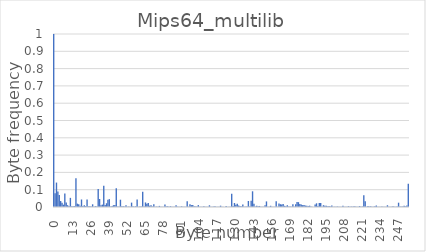
| Category | Series 0 |
|---|---|
| 0.0 | 1 |
| 1.0 | 0.08 |
| 2.0 | 0.141 |
| 3.0 | 0.089 |
| 4.0 | 0.069 |
| 5.0 | 0.034 |
| 6.0 | 0.024 |
| 7.0 | 0.013 |
| 8.0 | 0.078 |
| 9.0 | 0.027 |
| 10.0 | 0.01 |
| 11.0 | 0.006 |
| 12.0 | 0.053 |
| 13.0 | 0.004 |
| 14.0 | 0.004 |
| 15.0 | 0.005 |
| 16.0 | 0.166 |
| 17.0 | 0.019 |
| 18.0 | 0.016 |
| 19.0 | 0.007 |
| 20.0 | 0.043 |
| 21.0 | 0.005 |
| 22.0 | 0.01 |
| 23.0 | 0.005 |
| 24.0 | 0.044 |
| 25.0 | 0.004 |
| 26.0 | 0.004 |
| 27.0 | 0.003 |
| 28.0 | 0.015 |
| 29.0 | 0.002 |
| 30.0 | 0.005 |
| 31.0 | 0.003 |
| 32.0 | 0.104 |
| 33.0 | 0.046 |
| 34.0 | 0.01 |
| 35.0 | 0.014 |
| 36.0 | 0.123 |
| 37.0 | 0.011 |
| 38.0 | 0.022 |
| 39.0 | 0.042 |
| 40.0 | 0.045 |
| 41.0 | 0.003 |
| 42.0 | 0.005 |
| 43.0 | 0.011 |
| 44.0 | 0.011 |
| 45.0 | 0.109 |
| 46.0 | 0.002 |
| 47.0 | 0.003 |
| 48.0 | 0.042 |
| 49.0 | 0.005 |
| 50.0 | 0.004 |
| 51.0 | 0.003 |
| 52.0 | 0.01 |
| 53.0 | 0.002 |
| 54.0 | 0.002 |
| 55.0 | 0.001 |
| 56.0 | 0.025 |
| 57.0 | 0.004 |
| 58.0 | 0.002 |
| 59.0 | 0.004 |
| 60.0 | 0.043 |
| 61.0 | 0.001 |
| 62.0 | 0.003 |
| 63.0 | 0.002 |
| 64.0 | 0.089 |
| 65.0 | 0.002 |
| 66.0 | 0.026 |
| 67.0 | 0.019 |
| 68.0 | 0.023 |
| 69.0 | 0.007 |
| 70.0 | 0.009 |
| 71.0 | 0.003 |
| 72.0 | 0.015 |
| 73.0 | 0.002 |
| 74.0 | 0.002 |
| 75.0 | 0.002 |
| 76.0 | 0.006 |
| 77.0 | 0.001 |
| 78.0 | 0.001 |
| 79.0 | 0.001 |
| 80.0 | 0.014 |
| 81.0 | 0.003 |
| 82.0 | 0.004 |
| 83.0 | 0.002 |
| 84.0 | 0.005 |
| 85.0 | 0.002 |
| 86.0 | 0.002 |
| 87.0 | 0.002 |
| 88.0 | 0.01 |
| 89.0 | 0.002 |
| 90.0 | 0.001 |
| 91.0 | 0.001 |
| 92.0 | 0.004 |
| 93.0 | 0.001 |
| 94.0 | 0.002 |
| 95.0 | 0.001 |
| 96.0 | 0.033 |
| 97.0 | 0.001 |
| 98.0 | 0.017 |
| 99.0 | 0.011 |
| 100.0 | 0.012 |
| 101.0 | 0.005 |
| 102.0 | 0.003 |
| 103.0 | 0.002 |
| 104.0 | 0.011 |
| 105.0 | 0.002 |
| 106.0 | 0.002 |
| 107.0 | 0.001 |
| 108.0 | 0.004 |
| 109.0 | 0.001 |
| 110.0 | 0.001 |
| 111.0 | 0.001 |
| 112.0 | 0.01 |
| 113.0 | 0.002 |
| 114.0 | 0.002 |
| 115.0 | 0.003 |
| 116.0 | 0.004 |
| 117.0 | 0.001 |
| 118.0 | 0.001 |
| 119.0 | 0.001 |
| 120.0 | 0.008 |
| 121.0 | 0.002 |
| 122.0 | 0.001 |
| 123.0 | 0.001 |
| 124.0 | 0.005 |
| 125.0 | 0.001 |
| 126.0 | 0.001 |
| 127.0 | 0.002 |
| 128.0 | 0.077 |
| 129.0 | 0.006 |
| 130.0 | 0.023 |
| 131.0 | 0.013 |
| 132.0 | 0.019 |
| 133.0 | 0.009 |
| 134.0 | 0.005 |
| 135.0 | 0.004 |
| 136.0 | 0.015 |
| 137.0 | 0.002 |
| 138.0 | 0.002 |
| 139.0 | 0.002 |
| 140.0 | 0.035 |
| 141.0 | 0.003 |
| 142.0 | 0.036 |
| 143.0 | 0.091 |
| 144.0 | 0.019 |
| 145.0 | 0.003 |
| 146.0 | 0.007 |
| 147.0 | 0.004 |
| 148.0 | 0.006 |
| 149.0 | 0.001 |
| 150.0 | 0.002 |
| 151.0 | 0.002 |
| 152.0 | 0.01 |
| 153.0 | 0.032 |
| 154.0 | 0.001 |
| 155.0 | 0.001 |
| 156.0 | 0.007 |
| 157.0 | 0.001 |
| 158.0 | 0.001 |
| 159.0 | 0.001 |
| 160.0 | 0.034 |
| 161.0 | 0.001 |
| 162.0 | 0.021 |
| 163.0 | 0.016 |
| 164.0 | 0.014 |
| 165.0 | 0.017 |
| 166.0 | 0.007 |
| 167.0 | 0.005 |
| 168.0 | 0.01 |
| 169.0 | 0.003 |
| 170.0 | 0.003 |
| 171.0 | 0.002 |
| 172.0 | 0.015 |
| 173.0 | 0.002 |
| 174.0 | 0.016 |
| 175.0 | 0.028 |
| 176.0 | 0.028 |
| 177.0 | 0.017 |
| 178.0 | 0.014 |
| 179.0 | 0.011 |
| 180.0 | 0.011 |
| 181.0 | 0.008 |
| 182.0 | 0.007 |
| 183.0 | 0.006 |
| 184.0 | 0.008 |
| 185.0 | 0.003 |
| 186.0 | 0.001 |
| 187.0 | 0.001 |
| 188.0 | 0.015 |
| 189.0 | 0.021 |
| 190.0 | 0.006 |
| 191.0 | 0.023 |
| 192.0 | 0.023 |
| 193.0 | 0.001 |
| 194.0 | 0.01 |
| 195.0 | 0.007 |
| 196.0 | 0.007 |
| 197.0 | 0.004 |
| 198.0 | 0.006 |
| 199.0 | 0.003 |
| 200.0 | 0.009 |
| 201.0 | 0.002 |
| 202.0 | 0.002 |
| 203.0 | 0.001 |
| 204.0 | 0.003 |
| 205.0 | 0.001 |
| 206.0 | 0.001 |
| 207.0 | 0.001 |
| 208.0 | 0.007 |
| 209.0 | 0.001 |
| 210.0 | 0.002 |
| 211.0 | 0.001 |
| 212.0 | 0.005 |
| 213.0 | 0.002 |
| 214.0 | 0.002 |
| 215.0 | 0.002 |
| 216.0 | 0.005 |
| 217.0 | 0.003 |
| 218.0 | 0.001 |
| 219.0 | 0.001 |
| 220.0 | 0.006 |
| 221.0 | 0.001 |
| 222.0 | 0.003 |
| 223.0 | 0.067 |
| 224.0 | 0.033 |
| 225.0 | 0.001 |
| 226.0 | 0.005 |
| 227.0 | 0.003 |
| 228.0 | 0.004 |
| 229.0 | 0.002 |
| 230.0 | 0.002 |
| 231.0 | 0.005 |
| 232.0 | 0.009 |
| 233.0 | 0.001 |
| 234.0 | 0.001 |
| 235.0 | 0.001 |
| 236.0 | 0.004 |
| 237.0 | 0.001 |
| 238.0 | 0.001 |
| 239.0 | 0.002 |
| 240.0 | 0.01 |
| 241.0 | 0.001 |
| 242.0 | 0.002 |
| 243.0 | 0.002 |
| 244.0 | 0.005 |
| 245.0 | 0.002 |
| 246.0 | 0.002 |
| 247.0 | 0.004 |
| 248.0 | 0.025 |
| 249.0 | 0.002 |
| 250.0 | 0.002 |
| 251.0 | 0.002 |
| 252.0 | 0.008 |
| 253.0 | 0.004 |
| 254.0 | 0.008 |
| 255.0 | 0.134 |